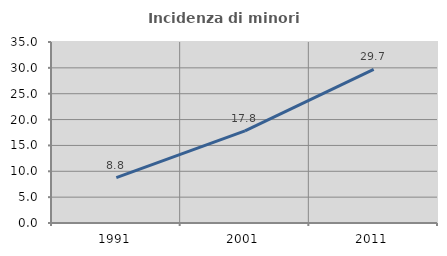
| Category | Incidenza di minori stranieri |
|---|---|
| 1991.0 | 8.772 |
| 2001.0 | 17.801 |
| 2011.0 | 29.717 |